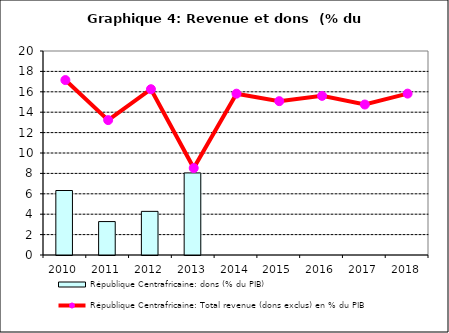
| Category | République Centrafricaine: dons (% du PIB) |
|---|---|
| 2010.0 | 6.324 |
| 2011.0 | 3.277 |
| 2012.0 | 4.278 |
| 2013.0 | 8.046 |
| 2014.0 | 0 |
| 2015.0 | 0 |
| 2016.0 | 0 |
| 2017.0 | 0 |
| 2018.0 | 0 |